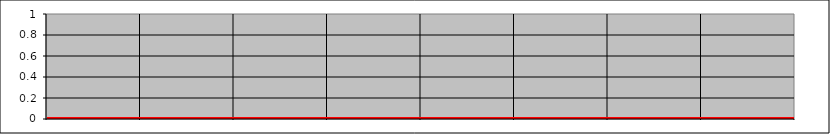
| Category | Series 1 | Series 2 | Series 3 | Series 0 |
|---|---|---|---|---|
| 0 | 0 | 0 | 0 |  |
| 1 | 0 | 0 | 0 |  |
| 2 | 0 | 0 | 0 |  |
| 3 | 0 | 0 | 0 |  |
| 4 | 0 | 0 | 0 |  |
| 5 | 0 | 0 | 0 |  |
| 6 | 0 | 0 | 0 |  |
| 7 | 0 | 0 | 0 |  |
| 8 | 0 | 0 | 0 |  |